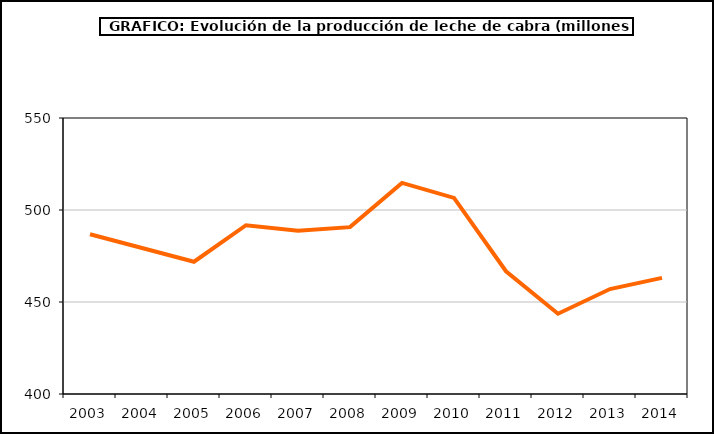
| Category | leche cabra |
|---|---|
| 2003.0 | 486.833 |
| 2004.0 | 479.36 |
| 2005.0 | 471.877 |
| 2006.0 | 491.735 |
| 2007.0 | 488.746 |
| 2008.0 | 490.682 |
| 2009.0 | 514.737 |
| 2010.0 | 506.6 |
| 2011.0 | 466.702 |
| 2012.0 | 443.625 |
| 2013.0 | 457.031 |
| 2014.0 | 463.094 |